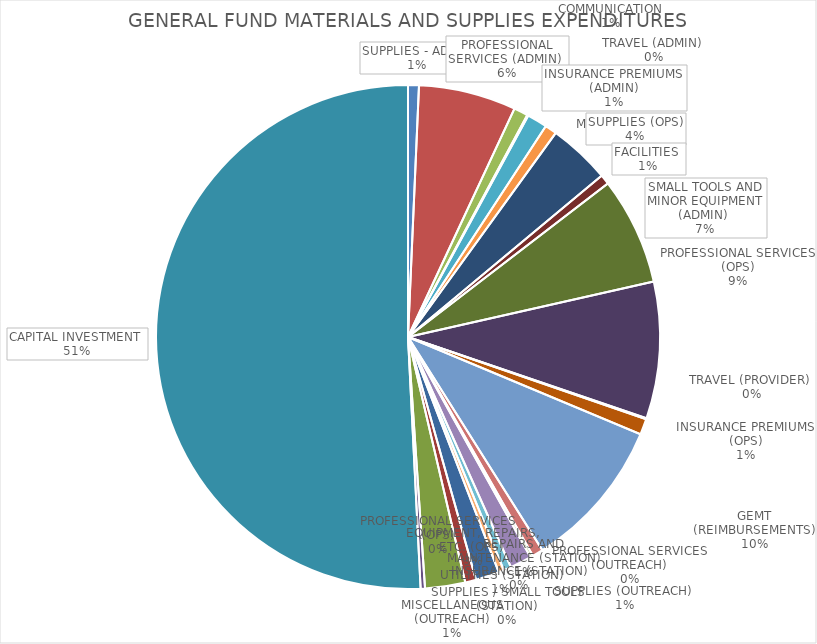
| Category | Series 0 |
|---|---|
| SUPPLIES - ADMIN | 10000 |
| PROFESSIONAL SERVICES (ADMIN)  | 89800 |
| COMMUNICATION | 13000 |
| TRAVEL (ADMIN)  | 1000 |
| INSURANCE PREMIUMS (ADMIN) | 18625 |
| MISCELLANEOUS  | 10950 |
| SUPPLIES (OPS) | 57100 |
| FACILITIES  | 9000 |
| SMALL TOOLS AND MINOR EQUIPMENT (ADMIN)  | 99000 |
| PROFESSIONAL SERVICES (OPS) | 126000 |
| TRAVEL (PROVIDER)  | 900 |
| INSURANCE PREMIUMS (OPS) | 14660 |
| GEMT (REIMBURSEMENTS) | 140000 |
| SUPPLIES (OUTREACH)  | 10000 |
| PROFESSIONAL SERVICES (OUTREACH) | 2500 |
| MISCELLANEOUS (OUTREACH) | 20000 |
| SUPPLIES / SMALL TOOLS (STATION) | 7000 |
|  INSURANCE (STATION)  | 4900 |
| UTILITIES (STATION) | 21800 |
| REPAIRS AND MAINTENANCE (STATION) | 10000 |
| EQUIPMENT, REPAIRS, ETC. (OPS)  | 37000 |
| PROFESSIONAL SERVICES (OPS) | 4000 |
| CAPITAL INVESTMENT  | 730209.88 |